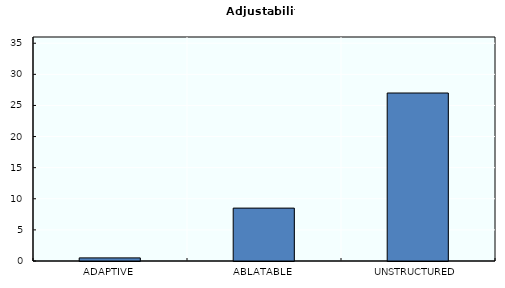
| Category | Adjustability |
|---|---|
| ADAPTIVE | 0.5 |
| ABLATABLE | 8.5 |
| UNSTRUCTURED | 27 |